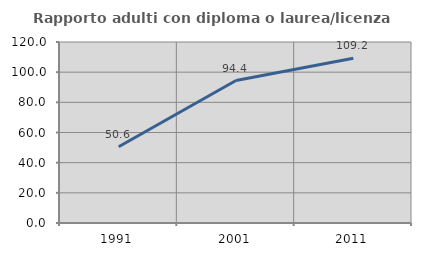
| Category | Rapporto adulti con diploma o laurea/licenza media  |
|---|---|
| 1991.0 | 50.588 |
| 2001.0 | 94.444 |
| 2011.0 | 109.184 |